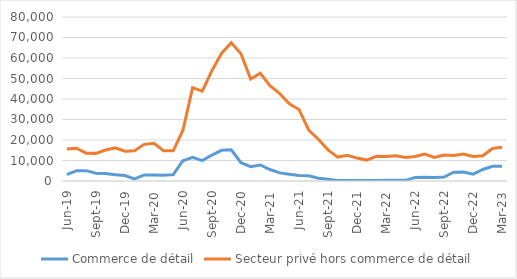
| Category | Commerce de détail | Secteur privé hors commerce de détail |
|---|---|---|
| 2019-06-01 | 3074 | 15593 |
| 2019-07-01 | 5013 | 15997 |
| 2019-08-01 | 5060 | 13575 |
| 2019-09-01 | 3805 | 13478 |
| 2019-10-01 | 3666 | 15104 |
| 2019-11-01 | 3083 | 16132 |
| 2019-12-01 | 2690 | 14521 |
| 2020-01-01 | 1059 | 14729 |
| 2020-02-01 | 2976 | 17866 |
| 2020-03-01 | 2878 | 18365 |
| 2020-04-01 | 2788 | 14741 |
| 2020-05-01 | 3095 | 14727 |
| 2020-06-01 | 9886 | 24768 |
| 2020-07-01 | 11506 | 45550 |
| 2020-08-01 | 9941 | 43824 |
| 2020-09-01 | 12669 | 53853 |
| 2020-10-01 | 14950 | 62330 |
| 2020-11-01 | 15207 | 67418 |
| 2020-12-01 | 8924 | 62040 |
| 2021-01-01 | 7010 | 49744 |
| 2021-02-01 | 7823 | 52583 |
| 2021-03-01 | 5615 | 46512 |
| 2021-04-01 | 3951 | 42693 |
| 2021-05-01 | 3306 | 37636 |
| 2021-06-01 | 2698 | 34906 |
| 2021-07-01 | 2537 | 24878 |
| 2021-08-01 | 1367 | 20382 |
| 2021-09-01 | 814 | 15183 |
| 2021-10-01 | 238 | 11660 |
| 2021-11-01 | 262 | 12509 |
| 2021-12-01 | 262 | 11179 |
| 2022-01-01 | 239 | 10206 |
| 2022-02-01 | 254 | 12030 |
| 2022-03-01 | 358 | 11983 |
| 2022-04-01 | 416 | 12307 |
| 2022-05-01 | 313 | 11451 |
| 2022-06-01 | 1763 | 11973 |
| 2022-07-01 | 1842 | 13113 |
| 2022-08-01 | 1732 | 11535 |
| 2022-09-01 | 1921 | 12671 |
| 2022-10-01 | 4264 | 12429 |
| 2022-11-01 | 4396 | 13198 |
| 2022-12-01 | 3309 | 11964 |
| 2023-01-01 | 5607 | 12330 |
| 2023-02-01 | 7215 | 15882 |
| 2023-03-01 | 7247 | 16469 |